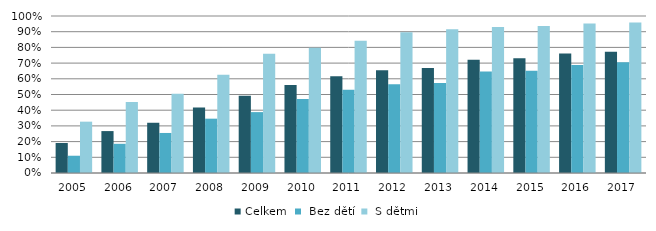
| Category | Celkem |  Bez dětí |  S dětmi |
|---|---|---|---|
| 2005.0 | 0.191 | 0.11 | 0.327 |
| 2006.0 | 0.267 | 0.186 | 0.453 |
| 2007.0 | 0.32 | 0.255 | 0.504 |
| 2008.0 | 0.417 | 0.346 | 0.626 |
| 2009.0 | 0.492 | 0.388 | 0.76 |
| 2010.0 | 0.56 | 0.472 | 0.798 |
| 2011.0 | 0.617 | 0.531 | 0.842 |
| 2012.0 | 0.654 | 0.565 | 0.896 |
| 2013.0 | 0.67 | 0.574 | 0.915 |
| 2014.0 | 0.721 | 0.646 | 0.93 |
| 2015.0 | 0.731 | 0.652 | 0.936 |
| 2016.0 | 0.761 | 0.688 | 0.953 |
| 2017.0 | 0.772 | 0.705 | 0.959 |